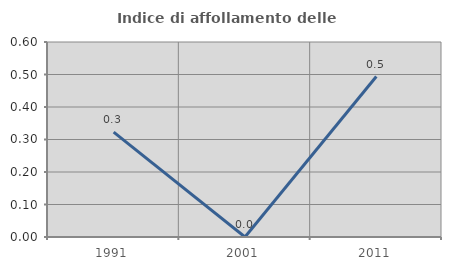
| Category | Indice di affollamento delle abitazioni  |
|---|---|
| 1991.0 | 0.323 |
| 2001.0 | 0 |
| 2011.0 | 0.494 |